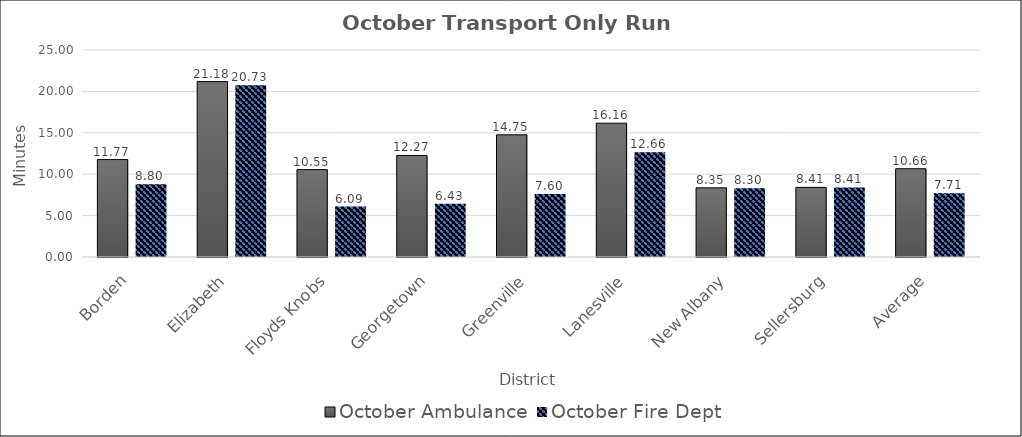
| Category | October |
|---|---|
| Borden | 8.8 |
| Elizabeth | 20.728 |
| Floyds Knobs | 6.092 |
| Georgetown | 6.432 |
| Greenville | 7.602 |
| Lanesville | 12.662 |
| New Albany | 8.3 |
| Sellersburg | 8.408 |
| Average | 7.71 |